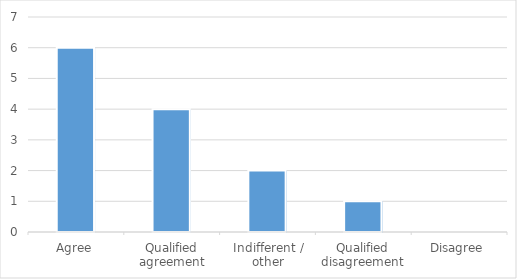
| Category | Series 0 |
|---|---|
| Agree | 6 |
| Qualified agreement | 4 |
| Indifferent / other | 2 |
| Qualified disagreement | 1 |
| Disagree | 0 |